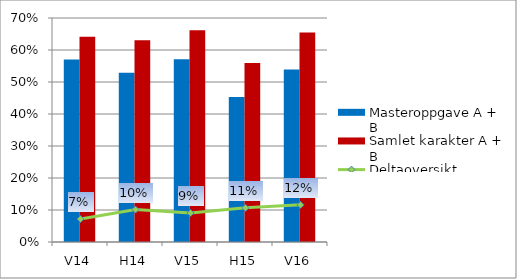
| Category | Masteroppgave A + B | Samlet karakter A + B |
|---|---|---|
| V14 | 0.57 | 0.642 |
| H14 | 0.529 | 0.63 |
| V15 | 0.571 | 0.662 |
| H15 | 0.453 | 0.56 |
| V16 | 0.539 | 0.655 |